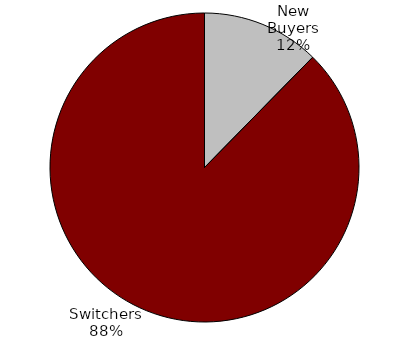
| Category | Series 0 |
|---|---|
| New Buyers | 0.123 |
| Switchers | 0.877 |